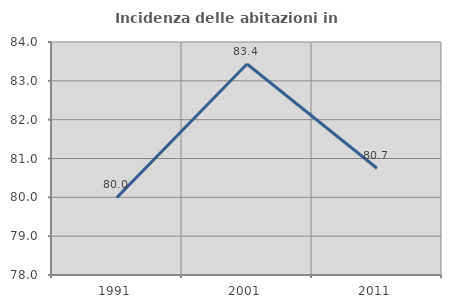
| Category | Incidenza delle abitazioni in proprietà  |
|---|---|
| 1991.0 | 80 |
| 2001.0 | 83.432 |
| 2011.0 | 80.748 |